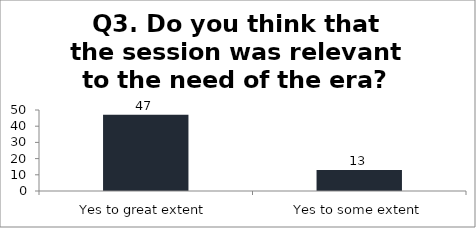
| Category | Q3. Do you think that the session was relevant to the need of the era? |
|---|---|
| Yes to great extent | 47 |
| Yes to some extent | 13 |